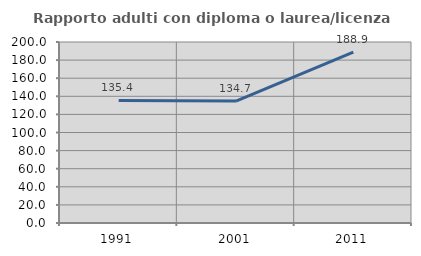
| Category | Rapporto adulti con diploma o laurea/licenza media  |
|---|---|
| 1991.0 | 135.366 |
| 2001.0 | 134.694 |
| 2011.0 | 188.889 |